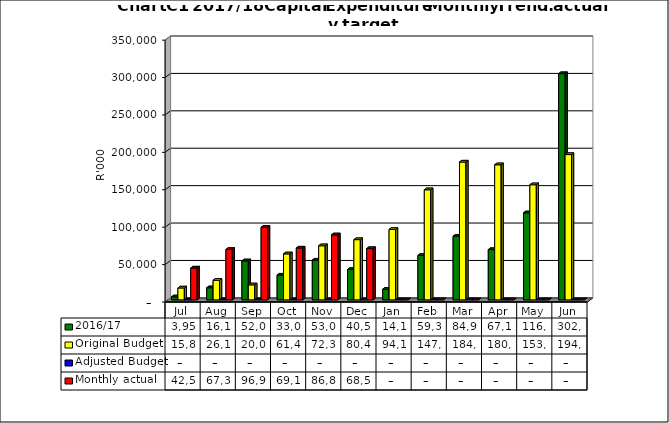
| Category | 2016/17 | Original Budget | Adjusted Budget | Monthly actual |
|---|---|---|---|---|
| Jul | 3958013.321 | 15888227.121 | 0 | 42514077.958 |
| Aug | 16119878.958 | 26147045.201 | 0 | 67305085.712 |
| Sep | 52071773.847 | 20000000 | 0 | 96927101.019 |
| Oct | 33023091.668 | 61424090.403 | 0 | 69191121.856 |
| Nov | 53074277.766 | 72300520.141 | 0 | 86835890.219 |
| Dec | 40503251.183 | 80450520.141 | 0 | 68525464.005 |
| Jan | 14140244.7 | 94117062.52 | 0 | 0 |
| Feb | 59318767.097 | 147118047.537 | 0 | 0 |
| Mar | 84955280.367 | 184167062.52 | 0 | 0 |
| Apr | 67166855.65 | 180519809.357 | 0 | 0 |
| May | 116269357.366 | 153826239.095 | 0 | 0 |
| Jun | 302312762.406 | 194159375.962 | 0 | 0 |